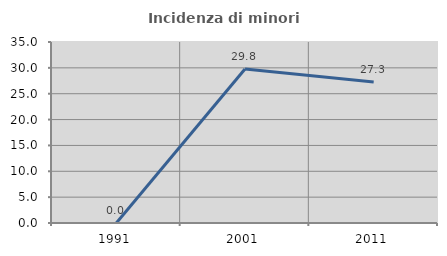
| Category | Incidenza di minori stranieri |
|---|---|
| 1991.0 | 0 |
| 2001.0 | 29.787 |
| 2011.0 | 27.273 |